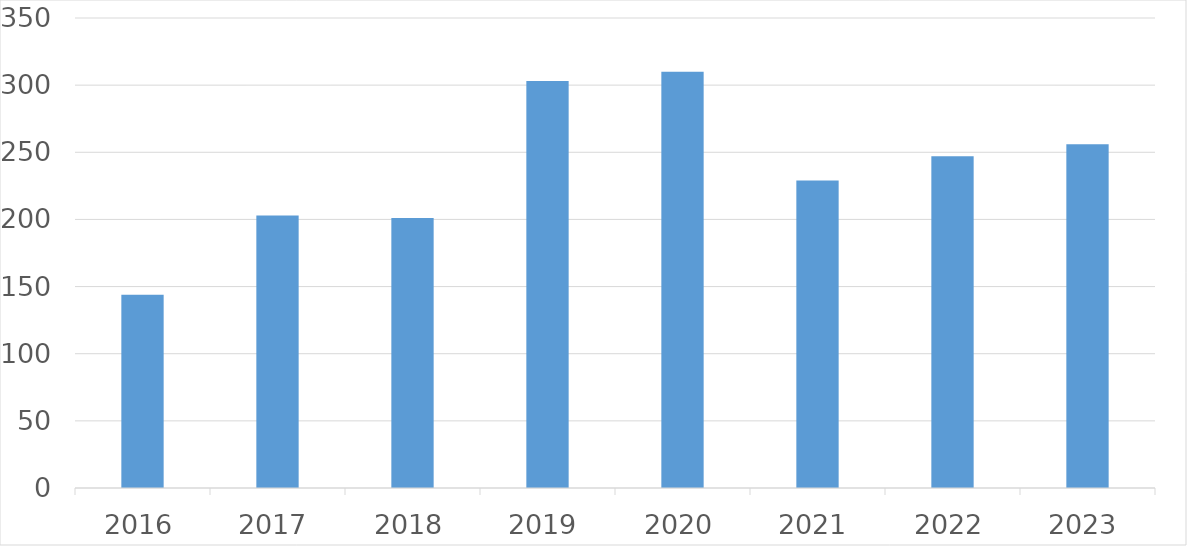
| Category | Series 0 |
|---|---|
| 2016 | 144 |
| 2017 | 203 |
| 2018 | 201 |
| 2019 | 303 |
| 2020 | 310 |
| 2021 | 229 |
| 2022 | 247 |
| 2023 | 256 |